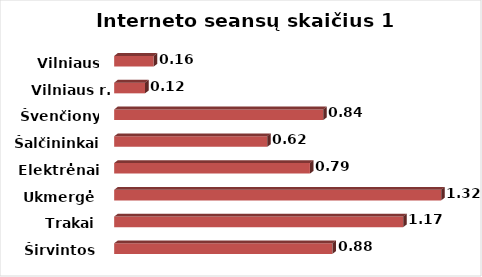
| Category | Series 0 |
|---|---|
| Širvintos | 0.881 |
| Trakai | 1.167 |
| Ukmergė | 1.32 |
| Elektrėnai | 0.79 |
| Šalčininkai | 0.618 |
| Švenčionys | 0.844 |
| Vilniaus r. | 0.124 |
| Vilniaus m. | 0.159 |